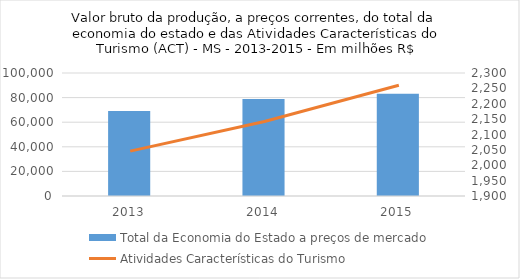
| Category | Total da Economia do Estado a preços de mercado |
|---|---|
| 2013.0 | 69203.2 |
| 2014.0 | 78950.13 |
| 2015.0 | 83082.34 |